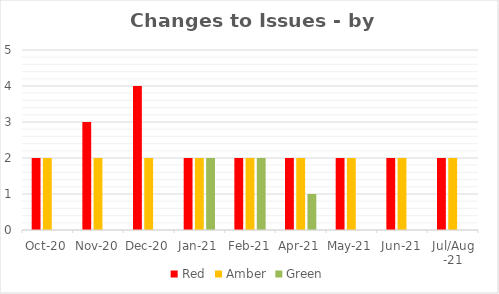
| Category | Red | Amber | Green |
|---|---|---|---|
| Oct-20 | 2 | 2 | 0 |
| Nov-20 | 3 | 2 | 0 |
| Dec-20 | 4 | 2 | 0 |
| Jan-21 | 2 | 2 | 2 |
| Feb-21 | 2 | 2 | 2 |
| Apr-21 | 2 | 2 | 1 |
| May-21 | 2 | 2 | 0 |
| Jun-21 | 2 | 2 | 0 |
| Jul/Aug -21 | 2 | 2 | 0 |